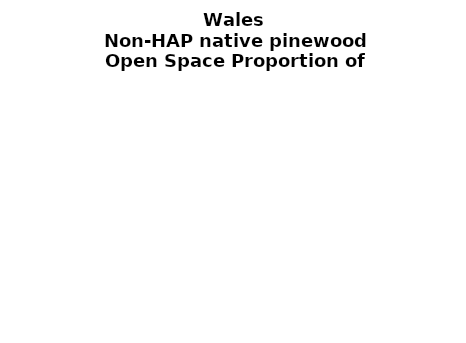
| Category | Non-HAP native pinewood |
|---|---|
|  ≥ 10ha, < 10%  | 0 |
|   ≥ 10ha, 10-25% | 0 |
|   ≥ 10ha, > 25 and <50%  | 0 |
|   ≥ 10ha, ≥ 50%  | 0 |
|  < 10ha, < 10% | 0 |
|  < 10ha, 10-25% | 0 |
|  < 10ha, > 25 and < 50% | 0 |
|  < 10ha, ≥ 50% | 0 |